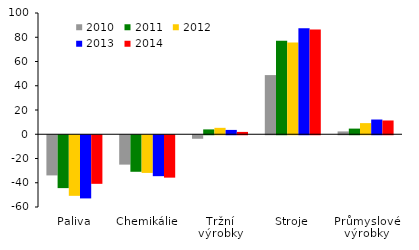
| Category | 2010 | 2011 | 2012 | 2013 | 2014 |
|---|---|---|---|---|---|
| Paliva | -33.122 | -43.599 | -49.965 | -52.094 | -40.065 |
| Chemikálie | -24.225 | -30.127 | -31.066 | -33.75 | -34.959 |
| Tržní výrobky | -2.907 | 3.994 | 5.295 | 3.578 | 1.932 |
| Stroje | 48.798 | 77.214 | 75.75 | 87.433 | 86.359 |
| Průmyslové výrobky | 2.326 | 4.657 | 9.183 | 12.146 | 11.357 |